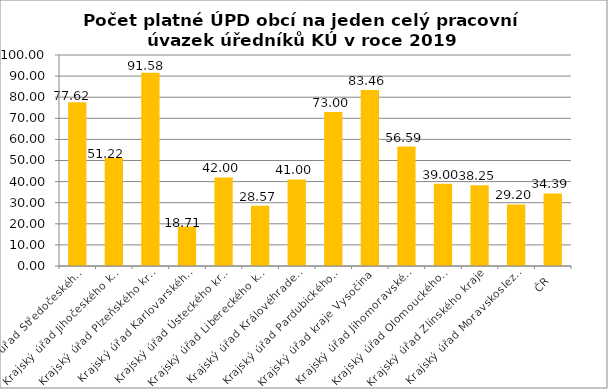
| Category | Počet platné ÚPD obcí na jeden celý pracovní úvazek úředníků KÚ |
|---|---|
| Krajský úřad Středočeského kraje | 77.62 |
| Krajský úřad Jihočeského kraje | 51.22 |
| Krajský úřad Plzeňského kraje | 91.58 |
| Krajský úřad Karlovarského kraje | 18.71 |
| Krajský úřad Ústeckého kraje | 42 |
| Krajský úřad Libereckého kraje | 28.57 |
| Krajský úřad Královéhradeckého kraje | 41 |
| Krajský úřad Pardubického kraje | 73 |
| Krajský úřad kraje Vysočina | 83.46 |
| Krajský úřad Jihomoravského kraje | 56.59 |
| Krajský úřad Olomouckého kraje | 39 |
| Krajský úřad Zlínského kraje | 38.25 |
| Krajský úřad Moravskoslezského kraje | 29.2 |
| ČR | 34.39 |